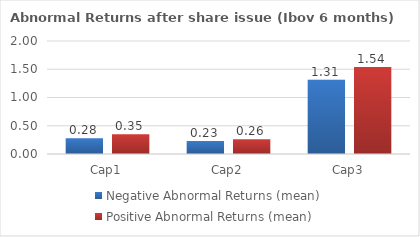
| Category | Negative Abnormal Returns (mean) | Positive Abnormal Returns (mean) |
|---|---|---|
| Cap1 | 0.279 | 0.348 |
| Cap2 | 0.228 | 0.259 |
| Cap3 | 1.313 | 1.538 |